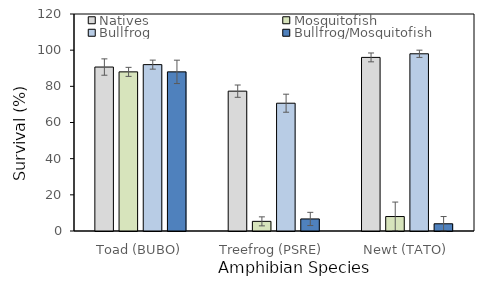
| Category | Natives | Mosquitofish | Bullfrog | Bullfrog/Mosquitofish |
|---|---|---|---|---|
| Toad (BUBO) | 90.667 | 88 | 92 | 88 |
| Treefrog (PSRE) | 77.333 | 5.333 | 70.667 | 6.667 |
| Newt (TATO) | 96 | 8 | 98 | 4 |